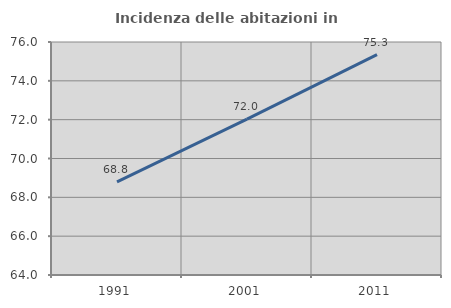
| Category | Incidenza delle abitazioni in proprietà  |
|---|---|
| 1991.0 | 68.8 |
| 2001.0 | 72.028 |
| 2011.0 | 75.346 |